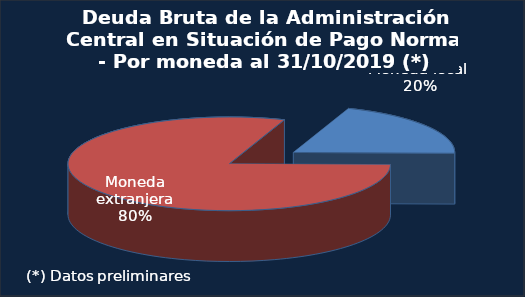
| Category | Series 0 |
|---|---|
| Moneda local (1) | 0.197 |
| Moneda extranjera | 0.803 |